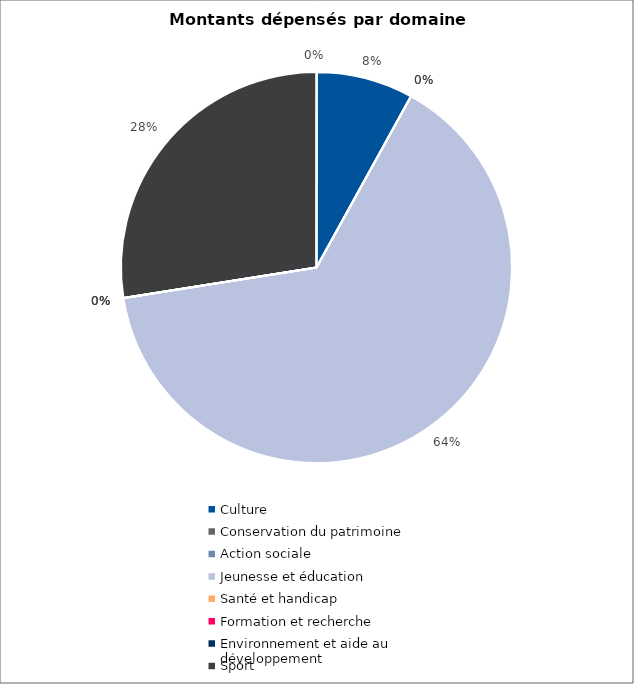
| Category | Series 0 |
|---|---|
| Culture | 510000 |
| Conservation du patrimoine | 0 |
| Action sociale | 0 |
| Jeunesse et éducation | 4095703 |
| Santé et handicap | 0 |
| Formation et recherche | 0 |
| Environnement et aide au
développement | 0 |
| Sport | 1747925 |
| Autres projets d’utilité publique | 0 |